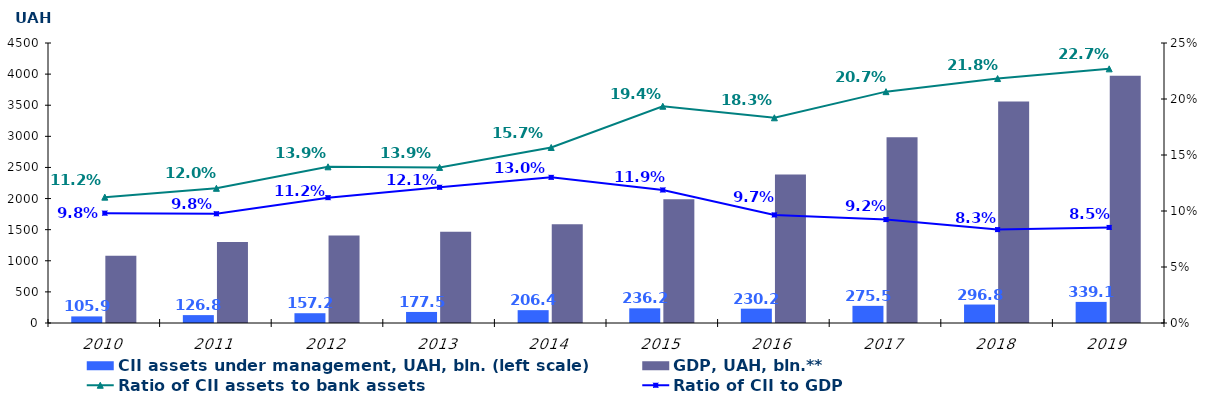
| Category | CII assets under management, UAH, bln. (left scale)  | GDP, UAH, bln.** |
|---|---|---|
| 2010.0 | 105.867 | 1079.346 |
| 2011.0 | 126.79 | 1299.991 |
| 2012.0 | 157.201 | 1404.669 |
| 2013.0 | 177.523 | 1465.198 |
| 2014.0 | 206.358 | 1586.915 |
| 2015.0 | 236.175 | 1988.544 |
| 2016.0 | 230.188 | 2385.367 |
| 2017.0 | 275.522 | 2983.882 |
| 2018.0 | 296.765 | 3558.706 |
| 2019.0 | 339.13 | 3974.564 |